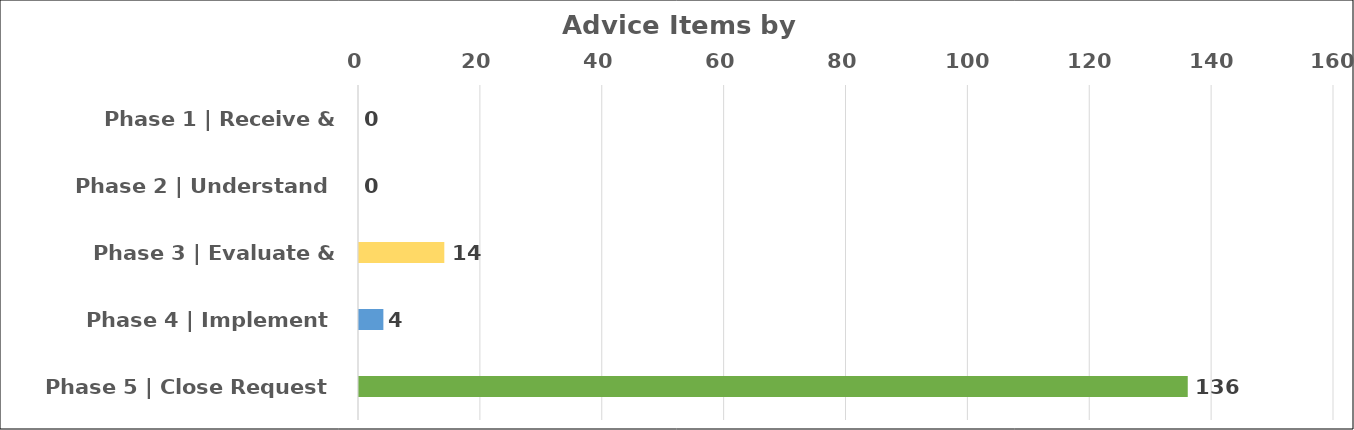
| Category | Series 0 |
|---|---|
| Phase 1 | Receive & Publish | 0 |
| Phase 2 | Understand | 0 |
| Phase 3 | Evaluate & Consider | 14 |
| Phase 4 | Implement | 4 |
| Phase 5 | Close Request | 136 |